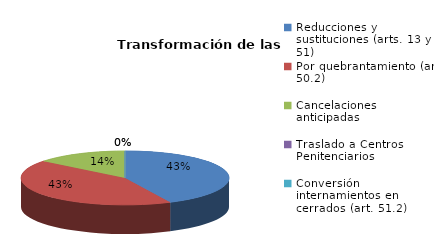
| Category | Series 0 |
|---|---|
| Reducciones y sustituciones (arts. 13 y 51) | 3 |
| Por quebrantamiento (art. 50.2) | 3 |
| Cancelaciones anticipadas | 1 |
| Traslado a Centros Penitenciarios | 0 |
| Conversión internamientos en cerrados (art. 51.2) | 0 |